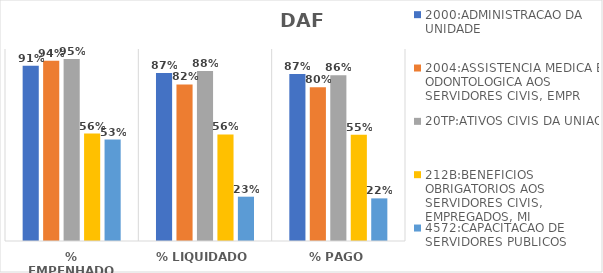
| Category | 2000:ADMINISTRACAO DA UNIDADE | 2004:ASSISTENCIA MEDICA E ODONTOLOGICA AOS SERVIDORES CIVIS, EMPR | 20TP:ATIVOS CIVIS DA UNIAO | 212B:BENEFICIOS OBRIGATORIOS AOS SERVIDORES CIVIS, EMPREGADOS, MI | 4572:CAPACITACAO DE SERVIDORES PUBLICOS FEDERAIS EM PROCESSO DE Q |
|---|---|---|---|---|---|
| % EMPENHADO | 0.912 | 0.939 | 0.947 | 0.559 | 0.528 |
| % LIQUIDADO | 0.875 | 0.815 | 0.885 | 0.555 | 0.231 |
| % PAGO | 0.869 | 0.801 | 0.864 | 0.554 | 0.222 |